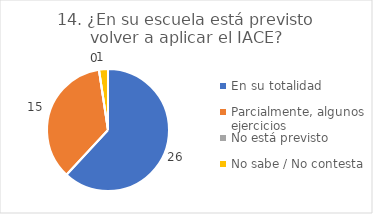
| Category | 14. ¿En su escuela está previsto volver a aplicar el IACE? |
|---|---|
| En su totalidad  | 0.619 |
| Parcialmente, algunos ejercicios  | 0.357 |
| No está previsto  | 0 |
| No sabe / No contesta | 0.024 |